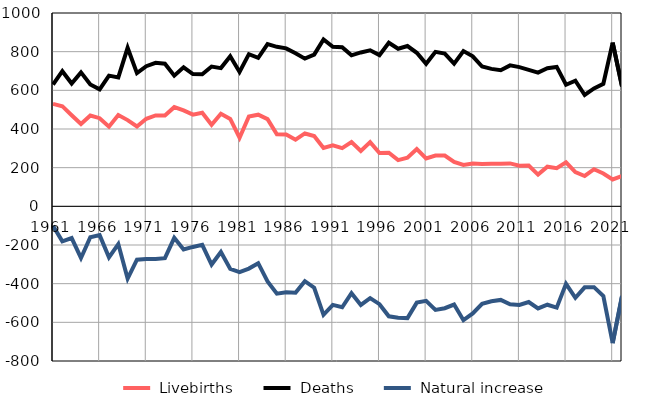
| Category |  Livebirths |  Deaths |  Natural increase |
|---|---|---|---|
| 1961.0 | 530 | 630 | -100 |
| 1962.0 | 518 | 699 | -181 |
| 1963.0 | 471 | 635 | -164 |
| 1964.0 | 426 | 693 | -267 |
| 1965.0 | 470 | 630 | -160 |
| 1966.0 | 456 | 605 | -149 |
| 1967.0 | 412 | 676 | -264 |
| 1968.0 | 472 | 667 | -195 |
| 1969.0 | 446 | 820 | -374 |
| 1970.0 | 413 | 689 | -276 |
| 1971.0 | 453 | 725 | -272 |
| 1972.0 | 470 | 742 | -272 |
| 1973.0 | 470 | 738 | -268 |
| 1974.0 | 513 | 676 | -163 |
| 1975.0 | 496 | 719 | -223 |
| 1976.0 | 474 | 684 | -210 |
| 1977.0 | 484 | 683 | -199 |
| 1978.0 | 422 | 723 | -301 |
| 1979.0 | 479 | 715 | -236 |
| 1980.0 | 452 | 776 | -324 |
| 1981.0 | 355 | 695 | -340 |
| 1982.0 | 465 | 787 | -322 |
| 1983.0 | 474 | 768 | -294 |
| 1984.0 | 451 | 839 | -388 |
| 1985.0 | 373 | 825 | -452 |
| 1986.0 | 372 | 817 | -445 |
| 1987.0 | 345 | 792 | -447 |
| 1988.0 | 377 | 764 | -387 |
| 1989.0 | 364 | 785 | -421 |
| 1990.0 | 302 | 863 | -561 |
| 1991.0 | 315 | 825 | -510 |
| 1992.0 | 301 | 823 | -522 |
| 1993.0 | 332 | 781 | -449 |
| 1994.0 | 286 | 796 | -510 |
| 1995.0 | 332 | 807 | -475 |
| 1996.0 | 276 | 782 | -506 |
| 1997.0 | 277 | 846 | -569 |
| 1998.0 | 239 | 815 | -576 |
| 1999.0 | 251 | 829 | -578 |
| 2000.0 | 296 | 794 | -498 |
| 2001.0 | 248 | 737 | -489 |
| 2002.0 | 263 | 799 | -536 |
| 2003.0 | 263 | 790 | -527 |
| 2004.0 | 230 | 738 | -508 |
| 2005.0 | 214 | 803 | -589 |
| 2006.0 | 222 | 776 | -554 |
| 2007.0 | 219 | 723 | -504 |
| 2008.0 | 220 | 711 | -491 |
| 2009.0 | 220 | 704 | -484 |
| 2010.0 | 222 | 729 | -507 |
| 2011.0 | 210 | 720 | -510 |
| 2012.0 | 211 | 706 | -495 |
| 2013.0 | 164 | 692 | -528 |
| 2014.0 | 205 | 714 | -509 |
| 2015.0 | 197 | 721 | -524 |
| 2016.0 | 228 | 629 | -401 |
| 2017.0 | 177 | 650 | -473 |
| 2018.0 | 157 | 576 | -419 |
| 2019.0 | 192 | 610 | -418 |
| 2020.0 | 170 | 634 | -464 |
| 2021.0 | 139 | 847 | -708 |
| 2022.0 | 157 | 621 | -464 |